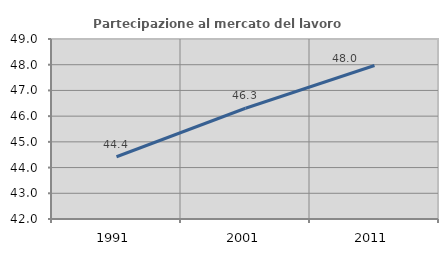
| Category | Partecipazione al mercato del lavoro  femminile |
|---|---|
| 1991.0 | 44.42 |
| 2001.0 | 46.308 |
| 2011.0 | 47.969 |